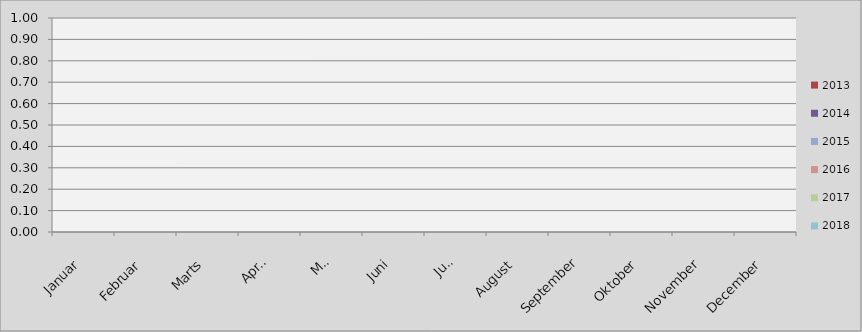
| Category | Series 0 | 2013 | 2014 | 2015 | 2016 | 2017 | 2018 |
|---|---|---|---|---|---|---|---|
| Januar |  |  |  |  |  |  | 0 |
| Februar |  |  |  |  |  |  | 0 |
| Marts |  |  |  |  |  |  | 0 |
| April |  |  |  |  |  |  | 0 |
| Maj |  |  |  |  |  |  | 0 |
| Juni |  |  |  |  |  |  | 0 |
| Juli |  |  |  |  |  |  | 0 |
| August |  |  |  |  |  |  | 0 |
| September |  |  |  |  |  |  | 0 |
| Oktober |  |  |  |  |  |  | 0 |
| November |  |  |  |  |  |  | 0 |
| December |  |  |  |  |  |  | 0 |